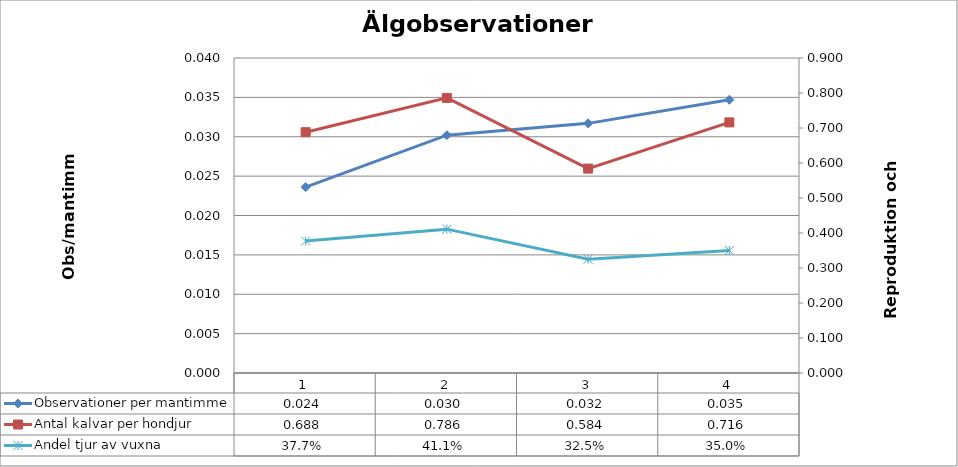
| Category | Observationer per mantimme |
|---|---|
| 0 | 0.024 |
| 1 | 0.03 |
| 2 | 0.032 |
| 3 | 0.035 |